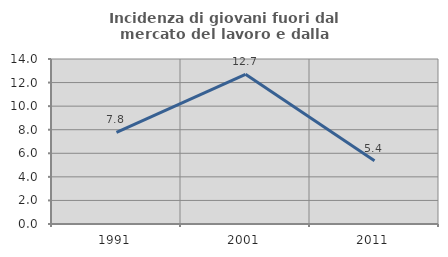
| Category | Incidenza di giovani fuori dal mercato del lavoro e dalla formazione  |
|---|---|
| 1991.0 | 7.767 |
| 2001.0 | 12.698 |
| 2011.0 | 5.357 |